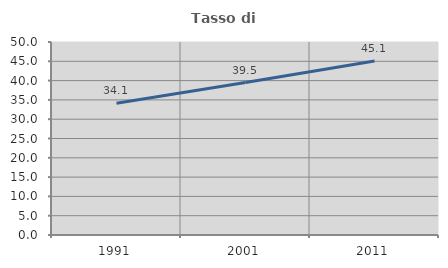
| Category | Tasso di occupazione   |
|---|---|
| 1991.0 | 34.106 |
| 2001.0 | 39.504 |
| 2011.0 | 45.092 |